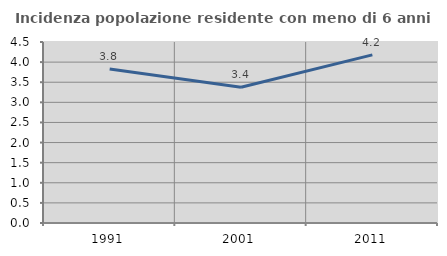
| Category | Incidenza popolazione residente con meno di 6 anni |
|---|---|
| 1991.0 | 3.83 |
| 2001.0 | 3.373 |
| 2011.0 | 4.179 |